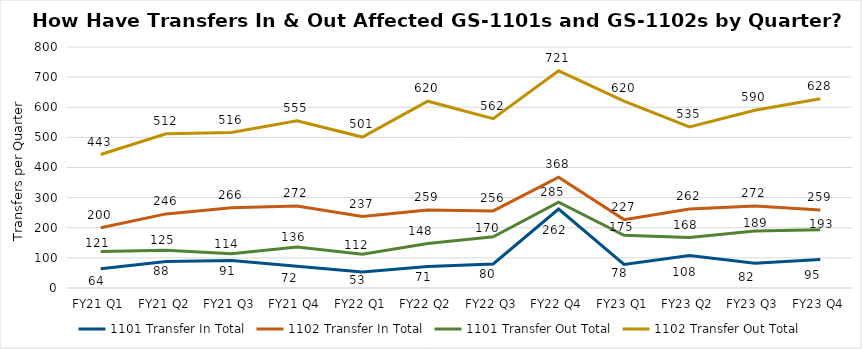
| Category | 1101 Transfer In Total | 1102 Transfer In Total | 1101 Transfer Out Total | 1102 Transfer Out Total |
|---|---|---|---|---|
| FY21 Q1 | 64 | 200 | 121 | 443 |
| FY21 Q2 | 88 | 246 | 125 | 512 |
| FY21 Q3 | 91 | 266 | 114 | 516 |
| FY21 Q4 | 72 | 272 | 136 | 555 |
| FY22 Q1 | 53 | 237 | 112 | 501 |
| FY22 Q2 | 71 | 259 | 148 | 620 |
| FY22 Q3 | 80 | 256 | 170 | 562 |
| FY22 Q4 | 262 | 368 | 285 | 721 |
| FY23 Q1 | 78 | 227 | 175 | 620 |
| FY23 Q2 | 108 | 262 | 168 | 535 |
| FY23 Q3 | 82 | 272 | 189 | 590 |
| FY23 Q4 | 95 | 259 | 193 | 628 |